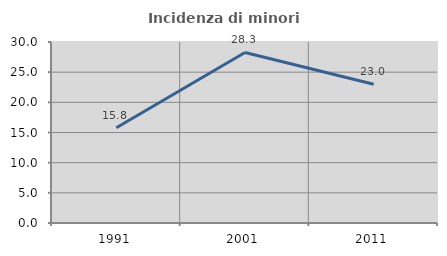
| Category | Incidenza di minori stranieri |
|---|---|
| 1991.0 | 15.789 |
| 2001.0 | 28.261 |
| 2011.0 | 23.009 |